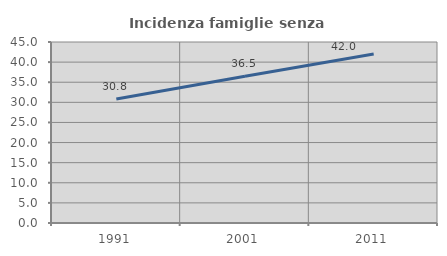
| Category | Incidenza famiglie senza nuclei |
|---|---|
| 1991.0 | 30.816 |
| 2001.0 | 36.475 |
| 2011.0 | 42.029 |